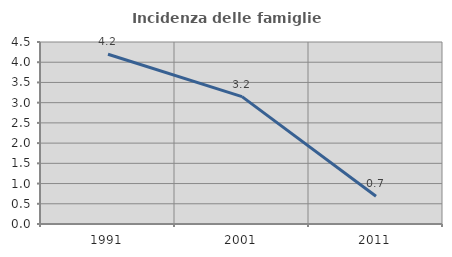
| Category | Incidenza delle famiglie numerose |
|---|---|
| 1991.0 | 4.196 |
| 2001.0 | 3.15 |
| 2011.0 | 0.686 |